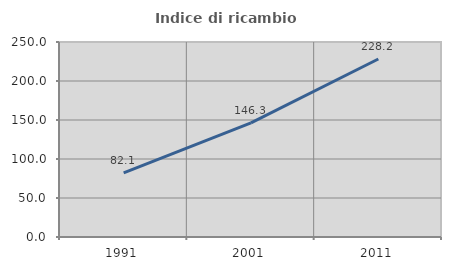
| Category | Indice di ricambio occupazionale  |
|---|---|
| 1991.0 | 82.119 |
| 2001.0 | 146.341 |
| 2011.0 | 228.235 |